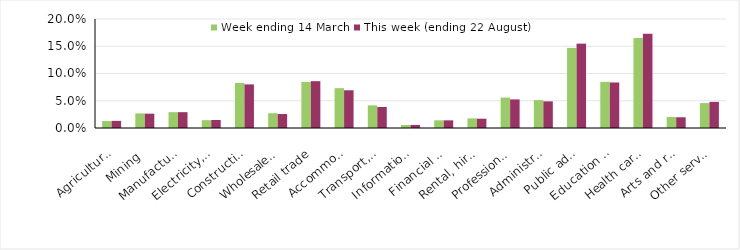
| Category | Week ending 14 March | This week (ending 22 August) |
|---|---|---|
| Agriculture, forestry and fishing | 0.013 | 0.013 |
| Mining | 0.027 | 0.026 |
| Manufacturing | 0.029 | 0.029 |
| Electricity, gas, water and waste services | 0.014 | 0.015 |
| Construction | 0.083 | 0.08 |
| Wholesale trade | 0.027 | 0.026 |
| Retail trade | 0.084 | 0.086 |
| Accommodation and food services | 0.073 | 0.069 |
| Transport, postal and warehousing | 0.042 | 0.039 |
| Information media and telecommunications | 0.006 | 0.006 |
| Financial and insurance services | 0.014 | 0.014 |
| Rental, hiring and real estate services | 0.018 | 0.017 |
| Professional, scientific and technical services | 0.056 | 0.052 |
| Administrative and support services | 0.051 | 0.049 |
| Public administration and safety | 0.147 | 0.155 |
| Education and training | 0.085 | 0.084 |
| Health care and social assistance | 0.165 | 0.173 |
| Arts and recreation services | 0.02 | 0.02 |
| Other services | 0.046 | 0.048 |